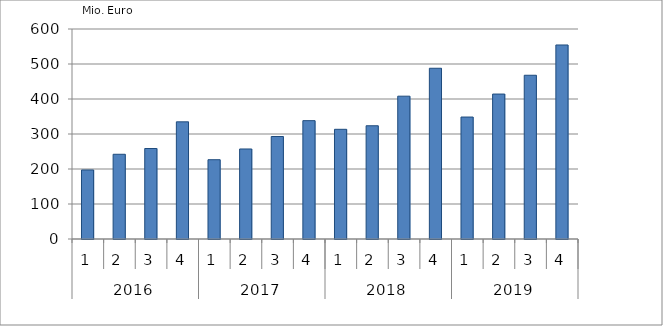
| Category | Ausbaugewerblicher Umsatz3 |
|---|---|
| 0 | 197219.532 |
| 1 | 242069.899 |
| 2 | 258547.84 |
| 3 | 334764.305 |
| 4 | 226552.317 |
| 5 | 257191.13 |
| 6 | 292853.372 |
| 7 | 338154.691 |
| 8 | 313433.569 |
| 9 | 323547.694 |
| 10 | 408057.42 |
| 11 | 487843.765 |
| 12 | 348466.115 |
| 13 | 414145.554 |
| 14 | 467849.207 |
| 15 | 554369.34 |